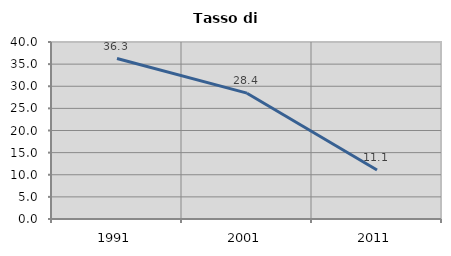
| Category | Tasso di disoccupazione   |
|---|---|
| 1991.0 | 36.259 |
| 2001.0 | 28.435 |
| 2011.0 | 11.068 |